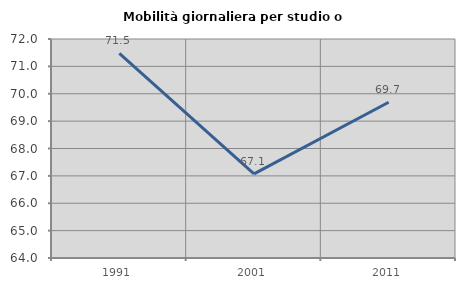
| Category | Mobilità giornaliera per studio o lavoro |
|---|---|
| 1991.0 | 71.472 |
| 2001.0 | 67.071 |
| 2011.0 | 69.691 |